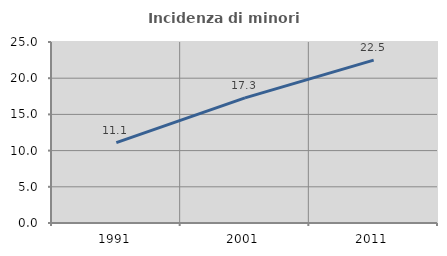
| Category | Incidenza di minori stranieri |
|---|---|
| 1991.0 | 11.111 |
| 2001.0 | 17.28 |
| 2011.0 | 22.492 |